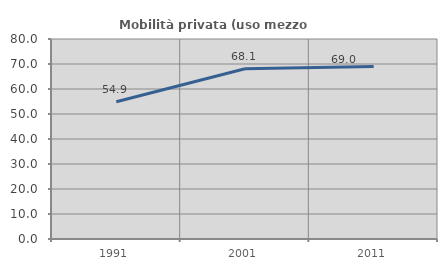
| Category | Mobilità privata (uso mezzo privato) |
|---|---|
| 1991.0 | 54.909 |
| 2001.0 | 68.105 |
| 2011.0 | 69.044 |